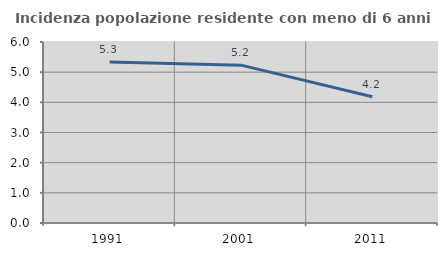
| Category | Incidenza popolazione residente con meno di 6 anni |
|---|---|
| 1991.0 | 5.339 |
| 2001.0 | 5.232 |
| 2011.0 | 4.184 |